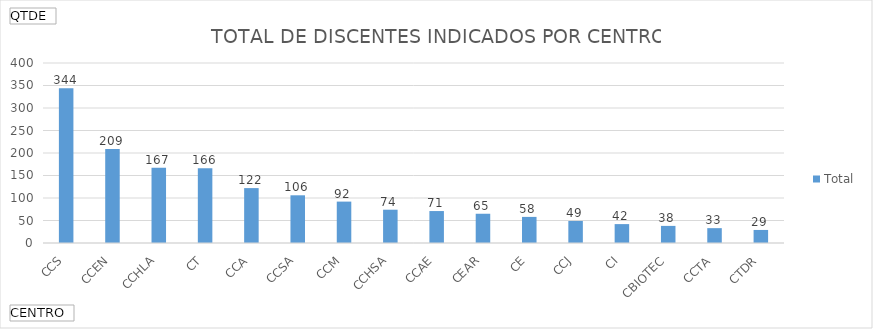
| Category | Total |
|---|---|
| CCS | 344 |
| CCEN | 209 |
| CCHLA | 167 |
| CT | 166 |
| CCA | 122 |
| CCSA | 106 |
| CCM | 92 |
| CCHSA | 74 |
| CCAE | 71 |
| CEAR | 65 |
| CE | 58 |
| CCJ | 49 |
| CI | 42 |
| CBIOTEC | 38 |
| CCTA | 33 |
| CTDR | 29 |